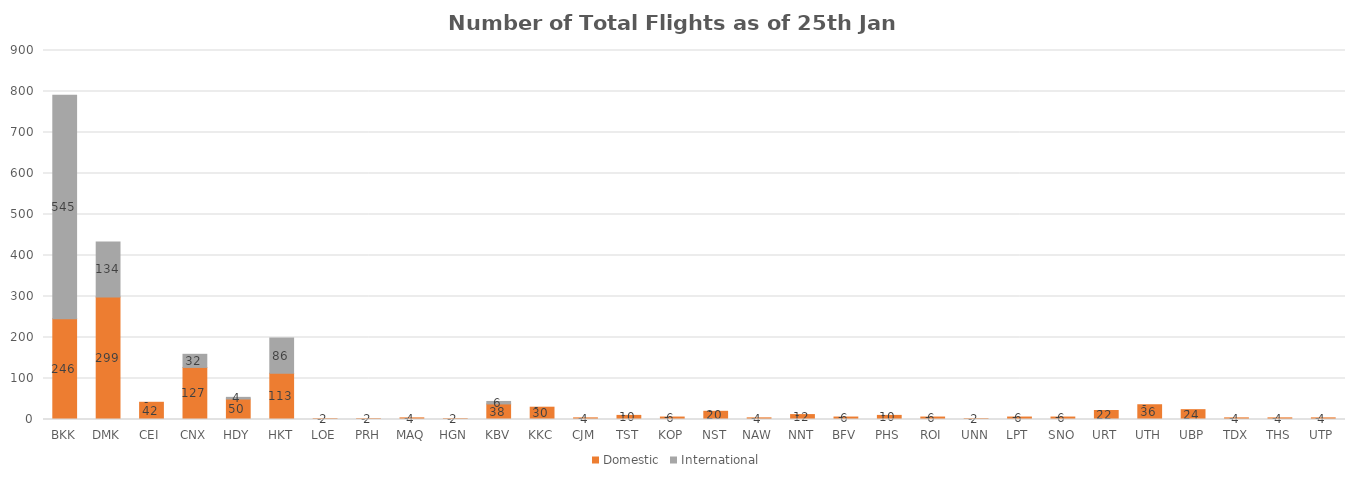
| Category | Domestic | International |
|---|---|---|
| BKK | 246 | 545 |
| DMK | 299 | 134 |
| CEI | 42 | 0 |
| CNX | 127 | 32 |
| HDY | 50 | 4 |
| HKT | 113 | 86 |
| LOE | 2 | 0 |
| PRH | 2 | 0 |
| MAQ | 4 | 0 |
| HGN | 2 | 0 |
| KBV | 38 | 6 |
| KKC | 30 | 0 |
| CJM | 4 | 0 |
| TST | 10 | 0 |
| KOP | 6 | 0 |
| NST | 20 | 0 |
| NAW | 4 | 0 |
| NNT | 12 | 0 |
| BFV | 6 | 0 |
| PHS | 10 | 0 |
| ROI | 6 | 0 |
| UNN | 2 | 0 |
| LPT | 6 | 0 |
| SNO | 6 | 0 |
| URT | 22 | 0 |
| UTH | 36 | 0 |
| UBP | 24 | 0 |
| TDX | 4 | 0 |
| THS | 4 | 0 |
| UTP | 4 | 0 |